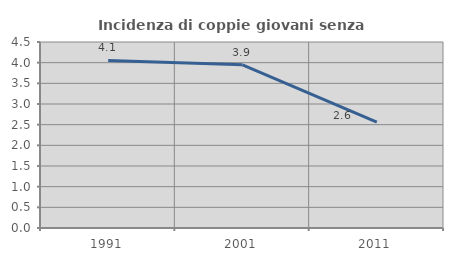
| Category | Incidenza di coppie giovani senza figli |
|---|---|
| 1991.0 | 4.054 |
| 2001.0 | 3.947 |
| 2011.0 | 2.564 |